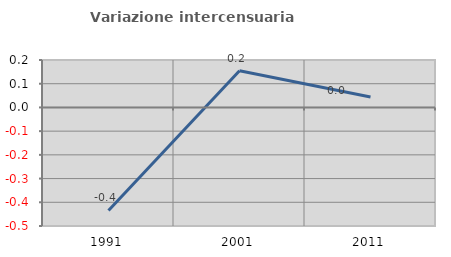
| Category | Variazione intercensuaria annua |
|---|---|
| 1991.0 | -0.434 |
| 2001.0 | 0.155 |
| 2011.0 | 0.044 |